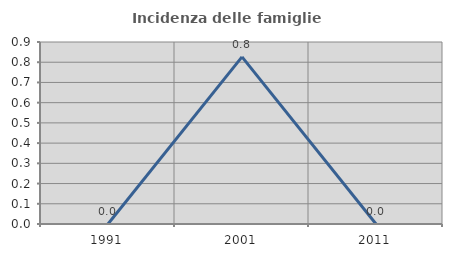
| Category | Incidenza delle famiglie numerose |
|---|---|
| 1991.0 | 0 |
| 2001.0 | 0.826 |
| 2011.0 | 0 |